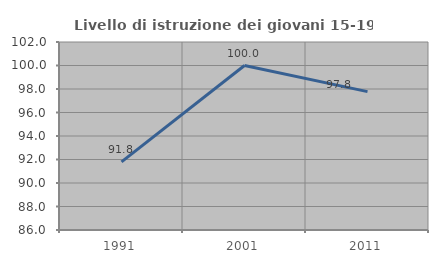
| Category | Livello di istruzione dei giovani 15-19 anni |
|---|---|
| 1991.0 | 91.803 |
| 2001.0 | 100 |
| 2011.0 | 97.778 |